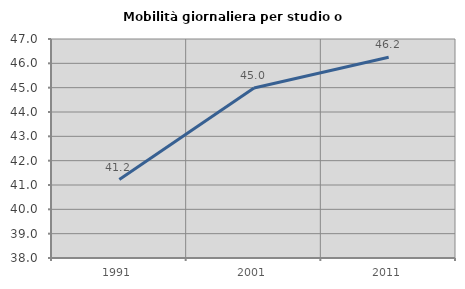
| Category | Mobilità giornaliera per studio o lavoro |
|---|---|
| 1991.0 | 41.224 |
| 2001.0 | 44.989 |
| 2011.0 | 46.247 |